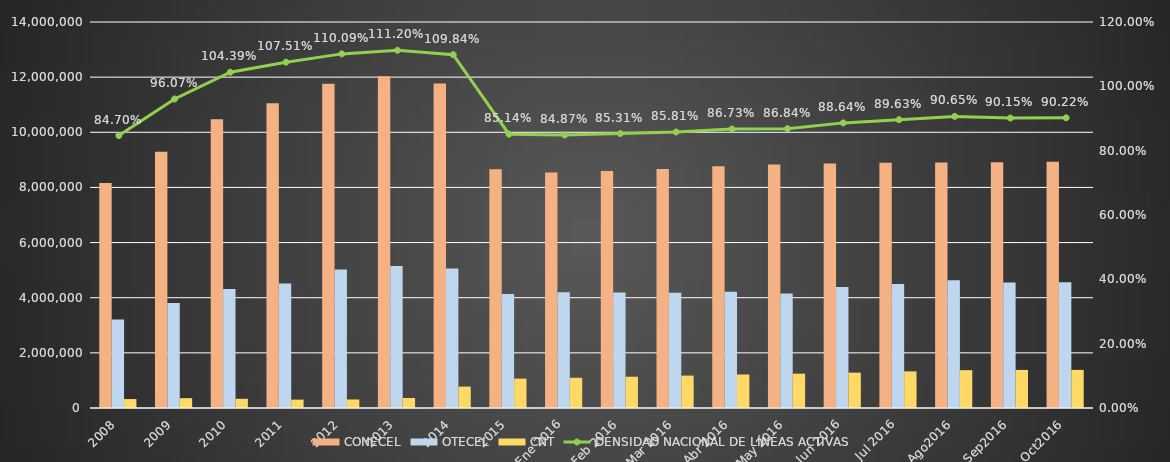
| Category | CONECEL | OTECEL | CNT |
|---|---|---|---|
| 2008 | 8156359 | 3211922 | 323967 |
| 2009 | 9291268 | 3806432 | 356900 |
| 2010 | 10470502 | 4314599 | 333730 |
| 2011 | 11057316 | 4513874 | 303368 |
| 2012 | 11757906 | 5019686 | 309271 |
| 2013 | 12030886 | 5148308 | 362560 |
| 2014 | 11772020 | 5055645 | 776892 |
| 2015 | 8658619 | 4134698 | 1065703 |
| Ene 2016 | 8537945 | 4200524 | 1095492 |
| Feb 2016 | 8600300 | 4188097 | 1134222 |
| Mar 2016 | 8664956 | 4182766 | 1174947 |
| Abr 2016 | 8763907 | 4211949 | 1215638 |
| May 2016 | 8830093 | 4151791 | 1245153 |
| Jun 2016 | 8864433 | 4392705 | 1282926 |
| Jul 2016 | 8893473 | 4499825 | 1328207 |
| Ago2016 | 8902397 | 4633731 | 1372087 |
| Sep2016 | 8915431 | 4548495 | 1380723 |
| Oct2016 | 8929127 | 4563659 | 1381589 |